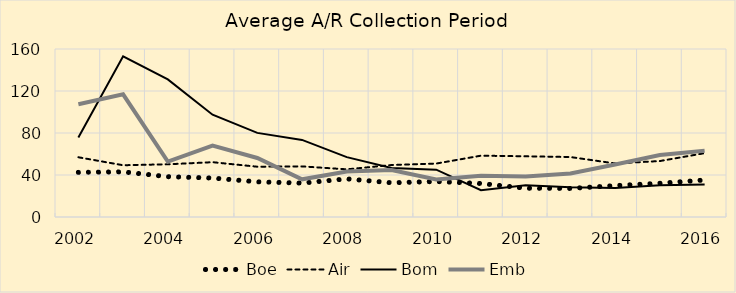
| Category | Boe | Air | Bom | Emb |
|---|---|---|---|---|
| 2002.0 | 42.5 | 56.9 | 75.8 | 107.4 |
| 2003.0 | 43 | 49.3 | 153.1 | 116.8 |
| 2004.0 | 38.4 | 50.2 | 131 | 52.8 |
| 2005.0 | 37.1 | 52.2 | 97.4 | 68 |
| 2006.0 | 33.5 | 47.9 | 80.1 | 56.2 |
| 2007.0 | 32.3 | 48.2 | 73.4 | 35.9 |
| 2008.0 | 36.3 | 45.4 | 57 | 43.3 |
| 2009.0 | 32.6 | 49.5 | 46.6 | 44.8 |
| 2010.0 | 33.8 | 50.9 | 45.1 | 35.7 |
| 2011.0 | 31.9 | 58.4 | 25.5 | 39.3 |
| 2012.0 | 27.4 | 57.8 | 30.3 | 38.6 |
| 2013.0 | 27.2 | 57.1 | 28.3 | 41.5 |
| 2014.0 | 29.9 | 51 | 27.6 | 50 |
| 2015.0 | 32.1 | 53.3 | 30.3 | 59.1 |
| 2016.0 | 35.2 | 60.8 | 31 | 63.1 |